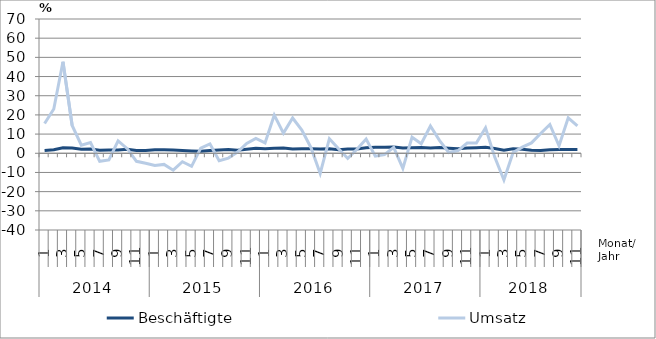
| Category | Beschäftigte | Umsatz |
|---|---|---|
| 0 | 1.4 | 15.5 |
| 1 | 1.8 | 23.1 |
| 2 | 2.9 | 47.7 |
| 3 | 2.7 | 14.5 |
| 4 | 2.1 | 4.2 |
| 5 | 2.2 | 5.6 |
| 6 | 1.6 | -4.2 |
| 7 | 1.7 | -3.5 |
| 8 | 1.7 | 6.5 |
| 9 | 2.1 | 2.4 |
| 10 | 1.4 | -4.2 |
| 11 | 1.4 | -5.2 |
| 12 | 1.8 | -6.4 |
| 13 | 1.8 | -5.8 |
| 14 | 1.7 | -8.8 |
| 15 | 1.5 | -4.4 |
| 16 | 1.2 | -6.8 |
| 17 | 1 | 2.7 |
| 18 | 1.4 | 4.9 |
| 19 | 1.7 | -3.9 |
| 20 | 2 | -2.5 |
| 21 | 1.6 | 0.6 |
| 22 | 2.1 | 5.1 |
| 23 | 2.6 | 7.7 |
| 24 | 2.4 | 5.4 |
| 25 | 2.6 | 19.9 |
| 26 | 2.7 | 10.5 |
| 27 | 2.2 | 18.4 |
| 28 | 2.3 | 12.1 |
| 29 | 2.3 | 2.9 |
| 30 | 2.2 | -10.5 |
| 31 | 2.4 | 7.6 |
| 32 | 1.8 | 2.4 |
| 33 | 2.2 | -2.7 |
| 34 | 2.2 | 2.1 |
| 35 | 2.9 | 7.4 |
| 36 | 3.2 | -1.5 |
| 37 | 3.2 | -0.7 |
| 38 | 3.3 | 3.1 |
| 39 | 2.7 | -7.9 |
| 40 | 2.9 | 8.4 |
| 41 | 3 | 5 |
| 42 | 2.8 | 14.2 |
| 43 | 3 | 6.6 |
| 44 | 2.6 | 0.4 |
| 45 | 2.3 | 1.4 |
| 46 | 2.7 | 5.3 |
| 47 | 2.9 | 5.4 |
| 48 | 3.1 | 13.3 |
| 49 | 2.5 | -2 |
| 50 | 1.6 | -13.9 |
| 51 | 2.4 | 0.4 |
| 52 | 2.1 | 3.2 |
| 53 | 1.6 | 5.4 |
| 54 | 1.5 | 10.3 |
| 55 | 1.8 | 15 |
| 56 | 2 | 3.9 |
| 57 | 2 | 18.5 |
| 58 | 2 | 14.3 |